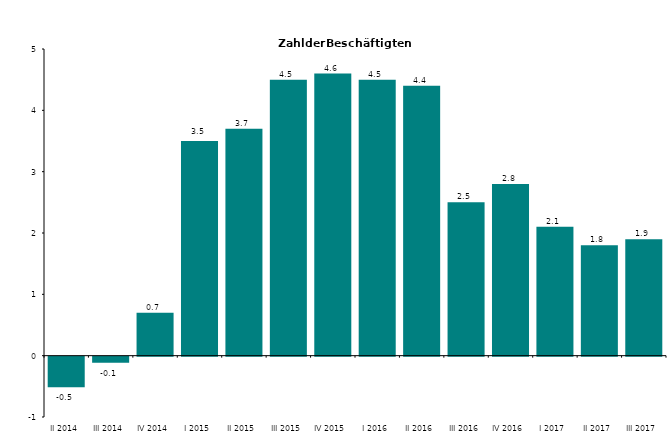
| Category | Series 0 |
|---|---|
| II 2014 | -0.5 |
| III 2014 | -0.1 |
| IV 2014 | 0.7 |
| I 2015 | 3.5 |
| II 2015 | 3.7 |
| III 2015 | 4.5 |
| IV 2015 | 4.6 |
| I 2016 | 4.5 |
| II 2016 | 4.4 |
| III 2016 | 2.5 |
| IV 2016 | 2.8 |
| I 2017 | 2.1 |
| II 2017 | 1.8 |
| III 2017 | 1.9 |